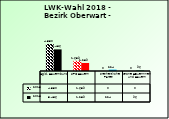
| Category | 2013 | 2018 |
|---|---|---|
| Bgld. Bauernbund | 4350 | 3486 |
| SPÖ Bauern | 1639 | 1289 |
| Freiheitliche Partei | 0 | 224 |
| Grüne Bäuerinnen und Bauern | 0 | 96 |